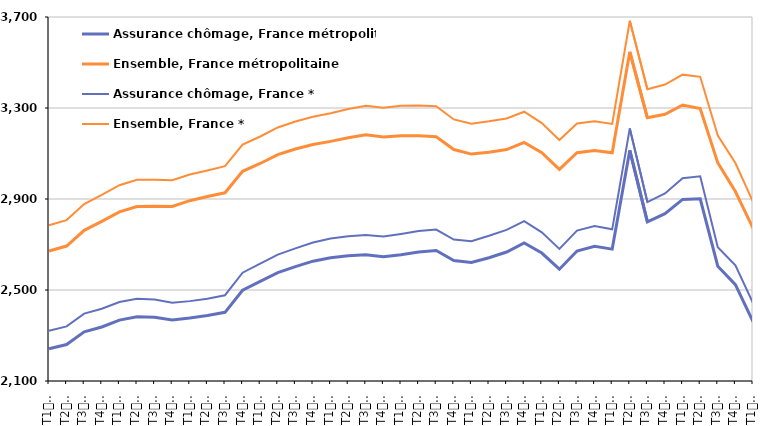
| Category | Assurance chômage, France métropolitaine | Ensemble, France métropolitaine | Assurance chômage, France * | Ensemble, France * |
|---|---|---|---|---|
| T1
2012 | 2242.1 | 2671.5 | 2321.3 | 2784.3 |
| T2
2012 | 2260.5 | 2693.2 | 2340.2 | 2807.2 |
| T3
2012 | 2316.1 | 2762.2 | 2396.2 | 2877.6 |
| T4
2012 | 2337.5 | 2801.5 | 2417.4 | 2917.7 |
| T1
2013 | 2367.8 | 2843.7 | 2447.3 | 2960.5 |
| T2
2013 | 2382.7 | 2867.2 | 2461.6 | 2984.3 |
| T3
2013 | 2379.9 | 2868.3 | 2457.9 | 2985 |
| T4
2013 | 2368 | 2867.5 | 2444 | 2982.8 |
| T1
2014 | 2376.6 | 2892.6 | 2451.1 | 3007.5 |
| T2
2014 | 2388.1 | 2911.3 | 2462 | 3025.7 |
| T3
2014 | 2401.9 | 2927.3 | 2477 | 3044.2 |
| T4
2014 | 2499 | 3021.9 | 2575.9 | 3139.2 |
| T1
2015 | 2537.9 | 3056.1 | 2616.1 | 3174.8 |
| T2
2015 | 2576.4 | 3094.9 | 2655.6 | 3214.4 |
| T3
2015 | 2602.7 | 3119.5 | 2683.2 | 3240.7 |
| T4
2015 | 2626.7 | 3139.4 | 2709 | 3261.5 |
| T1
2016 | 2641.9 | 3153.4 | 2726 | 3277.2 |
| T2
2016 | 2650.6 | 3169.4 | 2736.2 | 3295.6 |
| T3
2016 | 2655.1 | 3182.1 | 2741.6 | 3310.2 |
| T4
2016 | 2646.4 | 3172.1 | 2735.2 | 3301.1 |
| T1
2017 | 2655.2 | 3178 | 2746.3 | 3309.6 |
| T2
2017 | 2667.2 | 3177.8 | 2759.1 | 3310.7 |
| T3
2017 | 2673.4 | 3173.6 | 2765.9 | 3307.8 |
| T4
2017 | 2629.3 | 3117.5 | 2721.7 | 3249.7 |
| T1
2018 | 2620.8 | 3097.4 | 2714.4 | 3230.9 |
| T2
2018 | 2641.7 | 3105.1 | 2738.2 | 3241.4 |
| T3
2018 | 2666.9 | 3117.5 | 2764.3 | 3253.9 |
| T4
2018 | 2707 | 3148.9 | 2802.5 | 3283.7 |
| T1
2019 | 2662.5 | 3103.3 | 2753.5 | 3233.4 |
| T2
2019 | 2591.5 | 3030.1 | 2680.8 | 3159 |
| T3
2019 | 2671.5 | 3103.5 | 2761.4 | 3232.2 |
| T4
2019 | 2692.1 | 3113 | 2781.1 | 3241.9 |
| T1
2020 | 2679.7 | 3103.2 | 2766.6 | 3229.8 |
| T2
2020 | 3114 | 3546.8 | 3210.3 | 3683.6 |
| T3
2020 | 2799.8 | 3257 | 2886.7 | 3382.7 |
| T4
2020 | 2835.3 | 3272.2 | 2924.2 | 3403.3 |
| T1
2021 | 2898.3 | 3313.4 | 2990.9 | 3446.6 |
| T2
2021 | 2900.7 | 3298.1 | 3000 | 3437 |
| T3
2021 | 2604.5 | 3058.9 | 2688.4 | 3178.7 |
| T4
2021 | 2523.6 | 2932.8 | 2608.2 | 3058 |
| T1
2022 | 2361.1 | 2771.7 | 2442.3 | 2887.4 |